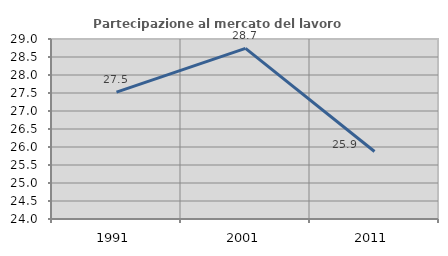
| Category | Partecipazione al mercato del lavoro  femminile |
|---|---|
| 1991.0 | 27.524 |
| 2001.0 | 28.739 |
| 2011.0 | 25.874 |